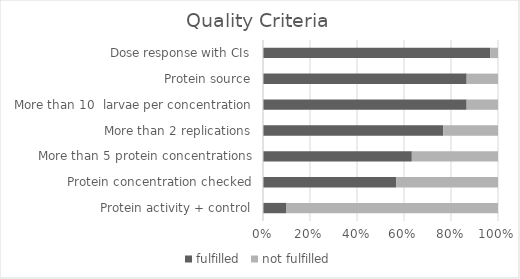
| Category | fulfilled | not fulfilled |
|---|---|---|
| Protein activity + control | 3 | 27 |
| Protein concentration checked | 17 | 13 |
|  More than 5 protein concentrations | 19 | 11 |
| More than 2 replications | 23 | 7 |
|  More than 10  larvae per concentration | 26 | 4 |
| Protein source | 26 | 4 |
| Dose response with CIs | 29 | 1 |